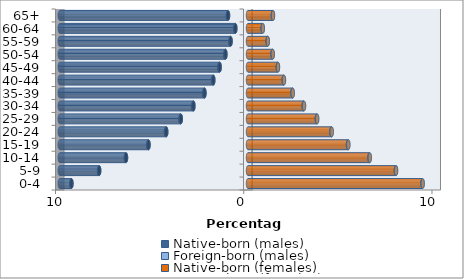
| Category | Native-born (males) | Foreign-born (males) | Native-born (females) | Foreign-born (females) |
|---|---|---|---|---|
| 0-4 | -9.379 | -0.009 | 9.266 | 0.013 |
| 5-9 | -7.906 | -0.01 | 7.854 | 0.014 |
| 10-14 | -6.48 | -0.012 | 6.453 | 0.019 |
| 15-19 | -5.286 | -0.015 | 5.31 | 0.024 |
| 20-24 | -4.343 | -0.019 | 4.425 | 0.026 |
| 25-29 | -3.57 | -0.022 | 3.654 | 0.025 |
| 30-34 | -2.9 | -0.023 | 2.956 | 0.022 |
| 35-39 | -2.313 | -0.021 | 2.361 | 0.017 |
| 40-44 | -1.842 | -0.018 | 1.898 | 0.013 |
| 45-49 | -1.506 | -0.014 | 1.584 | 0.01 |
| 50-54 | -1.199 | -0.011 | 1.304 | 0.008 |
| 55-59 | -0.926 | -0.009 | 1.044 | 0.007 |
| 60-64 | -0.673 | -0.008 | 0.778 | 0.006 |
| 65+ | -1.061 | -0.008 | 1.32 | 0.009 |